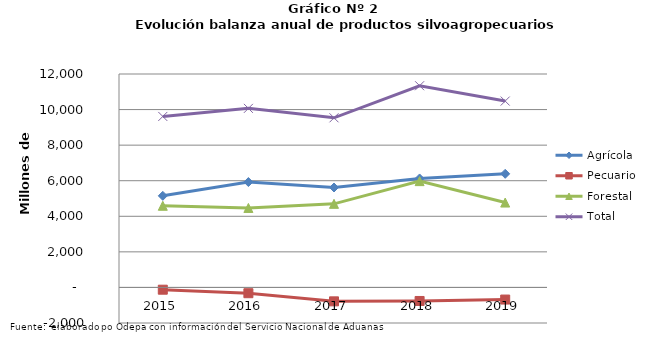
| Category | Agrícola | Pecuario | Forestal | Total |
|---|---|---|---|---|
| 2015.0 | 5149872 | -127785 | 4591408 | 9613495 |
| 2016.0 | 5924661 | -325421 | 4468104 | 10067344 |
| 2017.0 | 5619304 | -782654 | 4700192 | 9536842 |
| 2018.0 | 6126435 | -761998 | 5976134 | 11340571 |
| 2019.0 | 6388202 | -681915 | 4771638 | 10477925 |